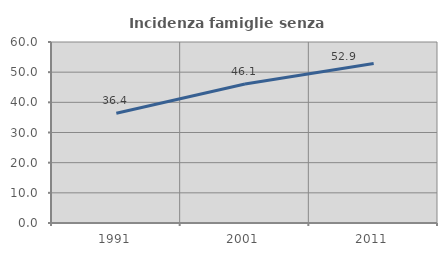
| Category | Incidenza famiglie senza nuclei |
|---|---|
| 1991.0 | 36.406 |
| 2001.0 | 46.087 |
| 2011.0 | 52.885 |